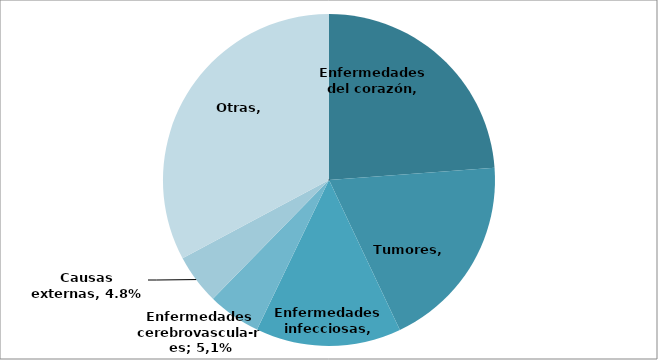
| Category | Series 0 |
|---|---|
| Enfermedades del corazón | 0.233 |
| Tumores | 0.188 |
| Enfermedades infecciosas | 0.139 |
| Enfermedades cerebrovasculares | 0.051 |
| Causas externas | 0.048 |
| Otras | 0.321 |